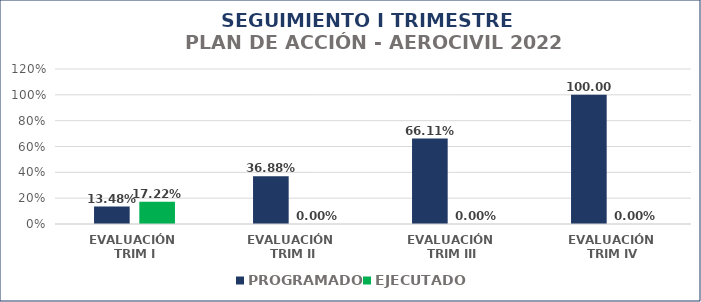
| Category | PROGRAMADO | EJECUTADO |
|---|---|---|
| EVALUACIÓN 
TRIM I | 0.135 | 0.172 |
| EVALUACIÓN 
TRIM II | 0.369 | 0 |
| EVALUACIÓN 
TRIM III | 0.661 | 0 |
| EVALUACIÓN
 TRIM IV | 1 | 0 |